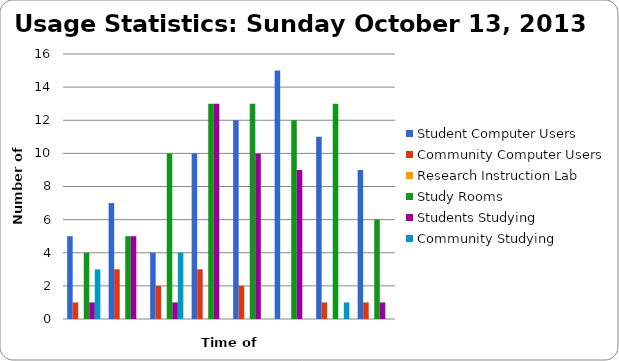
| Category | Student Computer Users | Community Computer Users | Research Instruction Lab | Study Rooms | Students Studying | Community Studying |
|---|---|---|---|---|---|---|
| 10 am | 5 | 1 | 0 | 4 | 1 | 3 |
| 11 am | 7 | 3 | 0 | 5 | 5 | 0 |
| 12 pm | 4 | 2 | 0 | 10 | 1 | 4 |
| 1 pm | 10 | 3 | 0 | 13 | 13 | 0 |
| 2 pm | 12 | 2 | 0 | 13 | 10 | 0 |
| 3 pm | 15 | 0 | 0 | 12 | 9 | 0 |
| 4 pm | 11 | 1 | 0 | 13 | 0 | 1 |
| 5 pm | 9 | 1 | 0 | 6 | 1 | 0 |